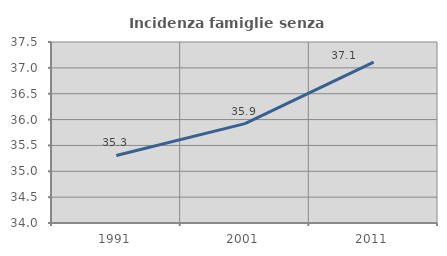
| Category | Incidenza famiglie senza nuclei |
|---|---|
| 1991.0 | 35.306 |
| 2001.0 | 35.922 |
| 2011.0 | 37.109 |